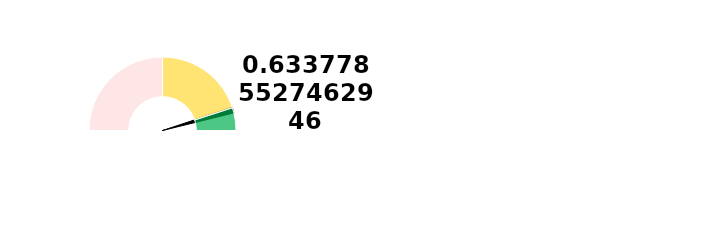
| Category | Ponteiro |
|---|---|
| 0 | 92.042 |
| 1 | 2.5 |
| 2 | 105.458 |